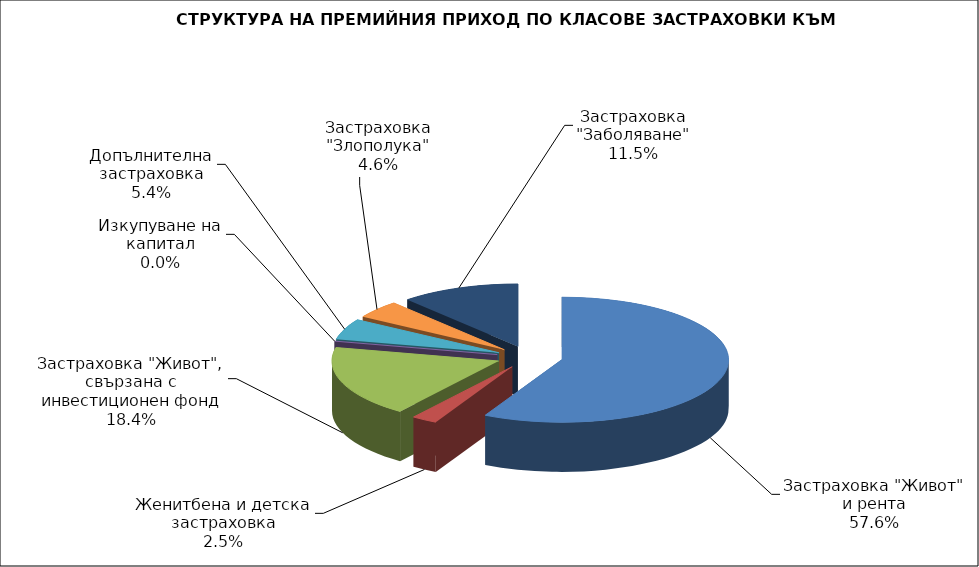
| Category | Series 0 |
|---|---|
| Застраховка "Живот" и рента | 89634700.593 |
| Женитбена и детска застраховка | 3872274.13 |
| Застраховка "Живот", свързана с инвестиционен фонд | 28621364.31 |
| Изкупуване на капитал | 0 |
| Допълнителна застраховка | 8396804.659 |
| Застраховка "Злополука" | 7166471.54 |
| Застраховка "Заболяване" | 17960842.63 |